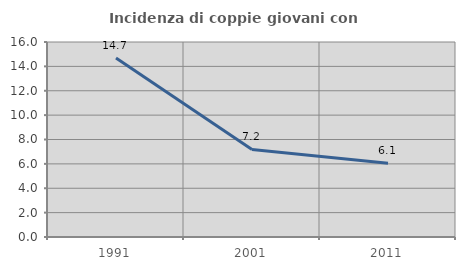
| Category | Incidenza di coppie giovani con figli |
|---|---|
| 1991.0 | 14.689 |
| 2001.0 | 7.188 |
| 2011.0 | 6.059 |